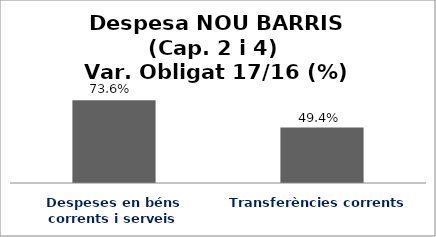
| Category | Series 0 |
|---|---|
| Despeses en béns corrents i serveis | 0.736 |
| Transferències corrents | 0.494 |